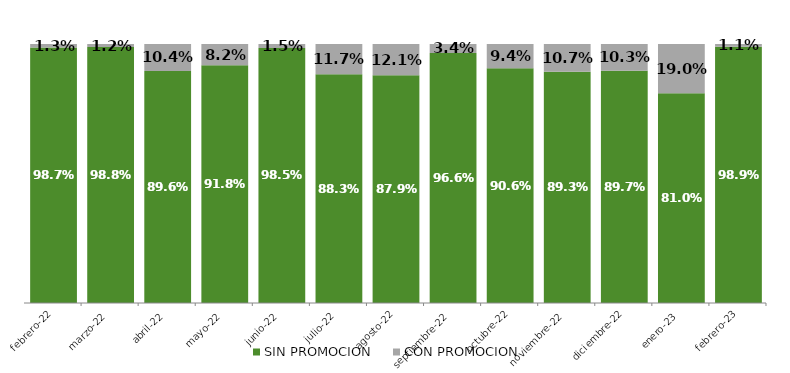
| Category | SIN PROMOCION   | CON PROMOCION   |
|---|---|---|
| 2022-02-01 | 0.987 | 0.013 |
| 2022-03-01 | 0.988 | 0.012 |
| 2022-04-01 | 0.896 | 0.104 |
| 2022-05-01 | 0.918 | 0.082 |
| 2022-06-01 | 0.985 | 0.015 |
| 2022-07-01 | 0.883 | 0.117 |
| 2022-08-01 | 0.879 | 0.121 |
| 2022-09-01 | 0.966 | 0.034 |
| 2022-10-01 | 0.906 | 0.094 |
| 2022-11-01 | 0.893 | 0.107 |
| 2022-12-01 | 0.897 | 0.103 |
| 2023-01-01 | 0.81 | 0.19 |
| 2023-02-01 | 0.989 | 0.011 |